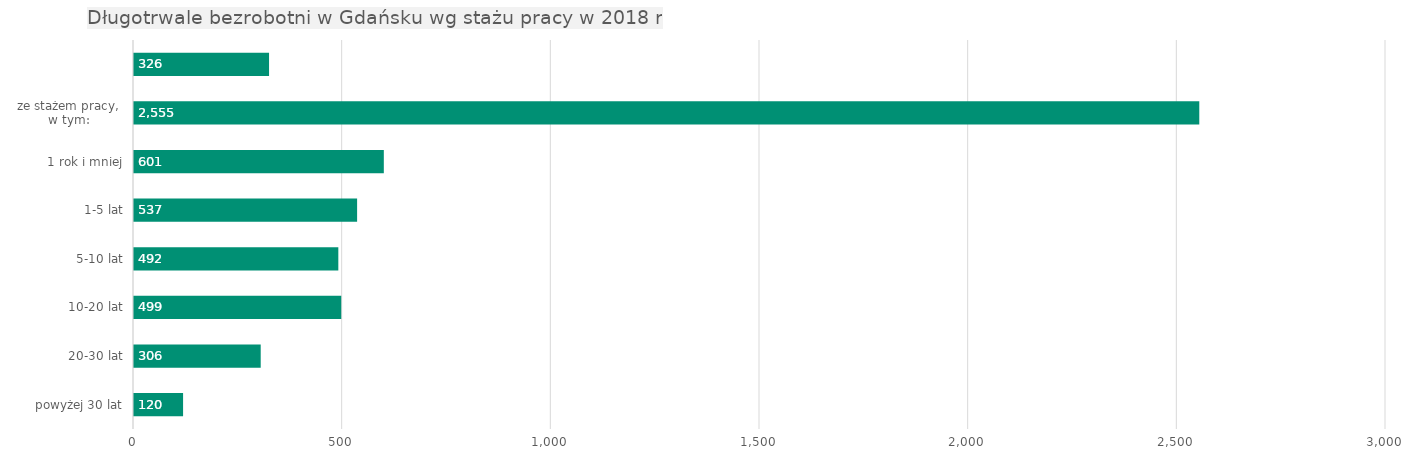
| Category | Series 0 |
|---|---|
|  | 326 |
| ze stażem pracy,
w tym: | 2555 |
|      1 rok i mniej | 601 |
|      1-5 lat | 537 |
|      5-10 lat | 492 |
|      10-20 lat | 499 |
|      20-30 lat | 306 |
|      powyżej 30 lat | 120 |